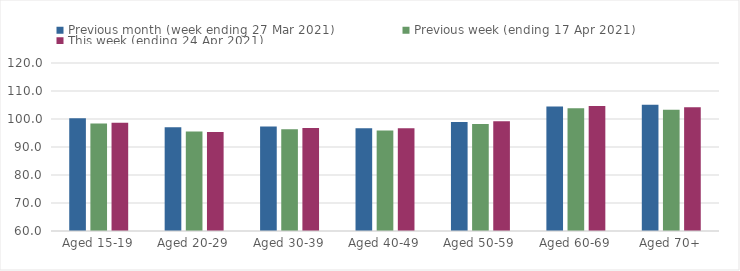
| Category | Previous month (week ending 27 Mar 2021) | Previous week (ending 17 Apr 2021) | This week (ending 24 Apr 2021) |
|---|---|---|---|
| Aged 15-19 | 100.27 | 98.41 | 98.66 |
| Aged 20-29 | 97.02 | 95.53 | 95.32 |
| Aged 30-39 | 97.3 | 96.37 | 96.75 |
| Aged 40-49 | 96.68 | 95.91 | 96.74 |
| Aged 50-59 | 98.91 | 98.24 | 99.17 |
| Aged 60-69 | 104.42 | 103.88 | 104.63 |
| Aged 70+ | 105.05 | 103.3 | 104.18 |